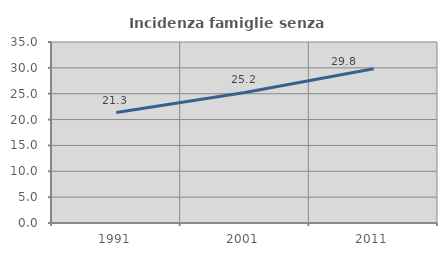
| Category | Incidenza famiglie senza nuclei |
|---|---|
| 1991.0 | 21.348 |
| 2001.0 | 25.237 |
| 2011.0 | 29.825 |